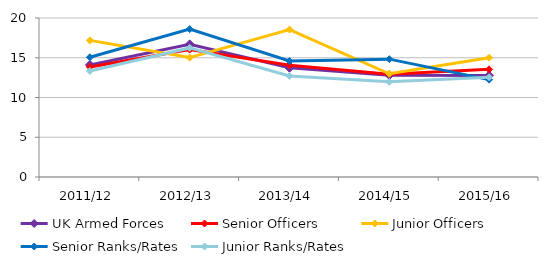
| Category | UK Armed Forces | Senior Officers | Junior Officers | Senior Ranks/Rates | Junior Ranks/Rates |
|---|---|---|---|---|---|
| 2011/12 | 14.099 | 13.848 | 17.184 | 15.064 | 13.34 |
| 2012/13 | 16.684 | 16.025 | 15.021 | 18.608 | 16.237 |
| 2013/14 | 13.733 | 14.071 | 18.549 | 14.587 | 12.705 |
| 2014/15 | 12.811 | 12.933 | 12.986 | 14.825 | 11.973 |
| 2015/16 | 12.77 | 13.538 | 15.007 | 12.247 | 12.554 |